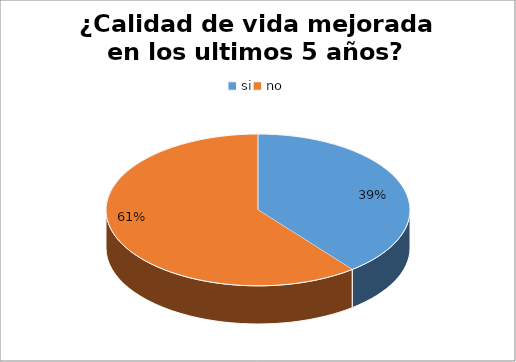
| Category | Series 0 |
|---|---|
| si | 37 |
| no | 57 |